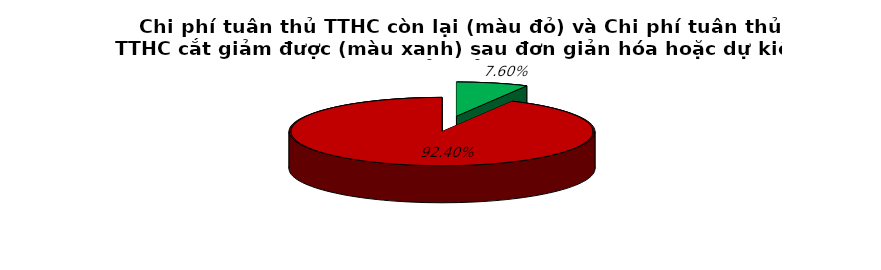
| Category | 7.6% 92.4% |
|---|---|
| 0 | 0.076 |
| 1 | 0.924 |